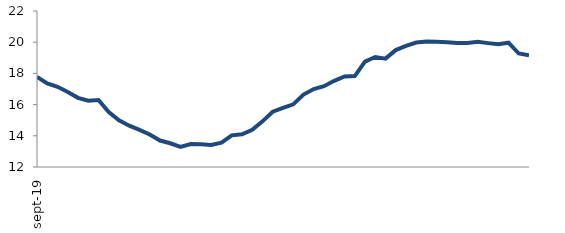
| Category | Series 0 |
|---|---|
| 2019-09-01 | 17.777 |
| 2019-10-01 | 17.36 |
| 2019-11-01 | 17.14 |
| 2019-12-01 | 16.808 |
| 2020-01-01 | 16.434 |
| 2020-02-01 | 16.25 |
| 2020-03-01 | 16.293 |
| 2020-04-01 | 15.517 |
| 2020-05-01 | 14.987 |
| 2020-06-01 | 14.648 |
| 2020-07-01 | 14.379 |
| 2020-08-01 | 14.088 |
| 2020-09-01 | 13.698 |
| 2020-10-01 | 13.522 |
| 2020-11-01 | 13.294 |
| 2020-12-01 | 13.469 |
| 2021-01-01 | 13.453 |
| 2021-02-01 | 13.409 |
| 2021-03-01 | 13.556 |
| 2021-04-01 | 14.027 |
| 2021-05-01 | 14.092 |
| 2021-06-01 | 14.388 |
| 2021-07-01 | 14.927 |
| 2021-08-01 | 15.546 |
| 2021-09-01 | 15.791 |
| 2021-10-01 | 16.017 |
| 2021-11-01 | 16.641 |
| 2021-12-01 | 16.998 |
| 2022-01-01 | 17.179 |
| 2022-02-01 | 17.527 |
| 2022-03-01 | 17.804 |
| 2022-04-01 | 17.825 |
| 2022-05-01 | 18.751 |
| 2022-06-01 | 19.052 |
| 2022-07-01 | 18.945 |
| 2022-08-01 | 19.494 |
| 2022-09-01 | 19.767 |
| 2022-10-01 | 19.975 |
| 2022-11-01 | 20.037 |
| 2022-12-01 | 20.03 |
| 2023-01-01 | 19.993 |
| 2023-02-01 | 19.949 |
| 2023-03-01 | 19.953 |
| 2023-04-01 | 20.023 |
| 2023-05-01 | 19.94 |
| 2023-06-01 | 19.871 |
| 2023-07-01 | 19.969 |
| 2023-08-01 | 19.275 |
| 2023-09-01 | 19.157 |